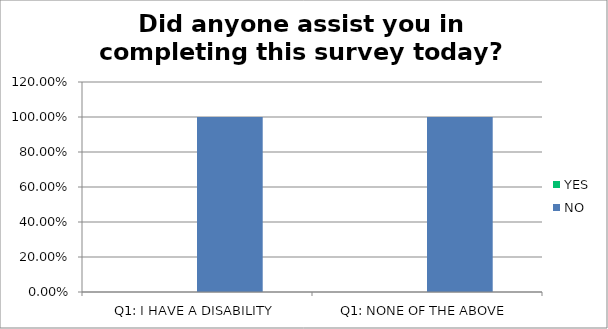
| Category | YES | NO |
|---|---|---|
| Q1: I HAVE A DISABILITY | 0 | 1 |
| Q1: NONE OF THE ABOVE | 0 | 1 |